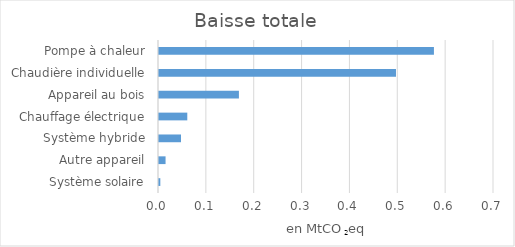
| Category | Baisse totale |
|---|---|
| Système solaire | 0.003 |
| Autre appareil | 0.014 |
| Système hybride | 0.046 |
| Chauffage électrique | 0.059 |
| Appareil au bois | 0.167 |
| Chaudière individuelle | 0.495 |
| Pompe à chaleur | 0.574 |